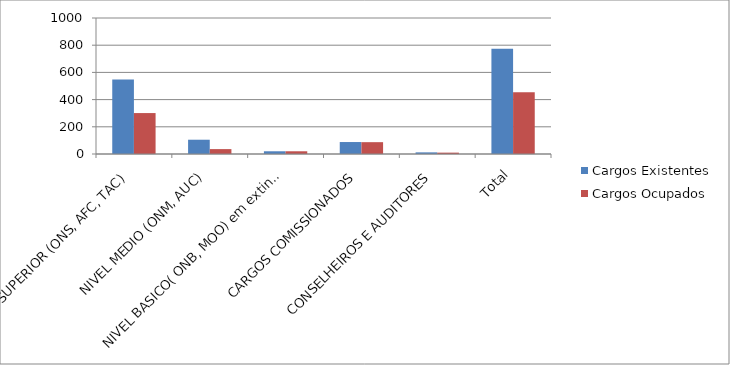
| Category | Cargos Existentes | Cargos Ocupados |
|---|---|---|
| NIVEL SUPERIOR (ONS, AFC, TAC) | 548 | 301 |
| NIVEL MEDIO (ONM, AUC) | 105 | 36 |
| NIVEL BASICO( ONB, MOO) em extinção | 20 | 20 |
| CARGOS COMISSIONADOS | 88 | 87 |
| CONSELHEIROS E AUDITORES | 12 | 10 |
| Total | 773 | 454 |